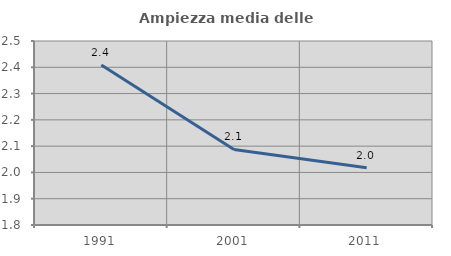
| Category | Ampiezza media delle famiglie |
|---|---|
| 1991.0 | 2.409 |
| 2001.0 | 2.088 |
| 2011.0 | 2.018 |